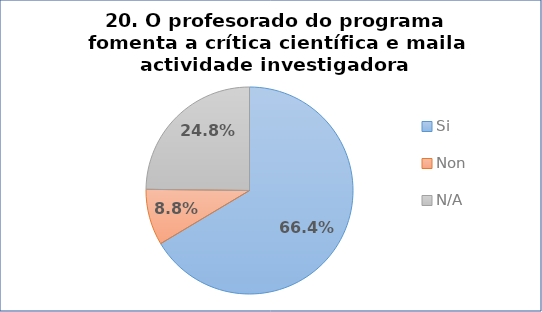
| Category | Pregunta 20. O profesorado do programa fomenta a crítica científica e maila actividade investigadora |
|---|---|
| Si | 0.664 |
| Non | 0.088 |
| N/A | 0.248 |